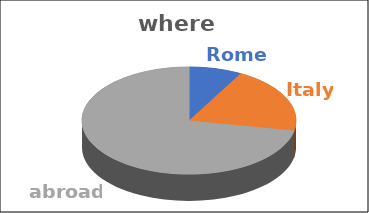
| Category | where | Series 1 | Series 2 | Series 3 | Series 4 |
|---|---|---|---|---|---|
| Rome | 0.08 |  |  |  |  |
| Italy | 0.2 |  |  |  |  |
| abroad | 0.72 |  |  |  |  |